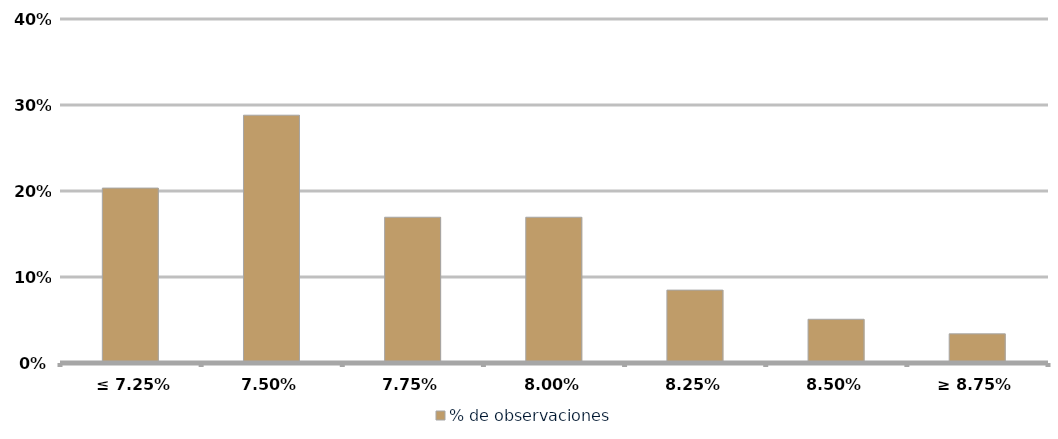
| Category | % de observaciones  |
|---|---|
|  ≤ 7.25% | 0.203 |
| 7,50% | 0.288 |
| 7,75% | 0.169 |
| 8,00% | 0.169 |
| 8,25% | 0.085 |
| 8,50% | 0.051 |
| ≥ 8.75% | 0.034 |